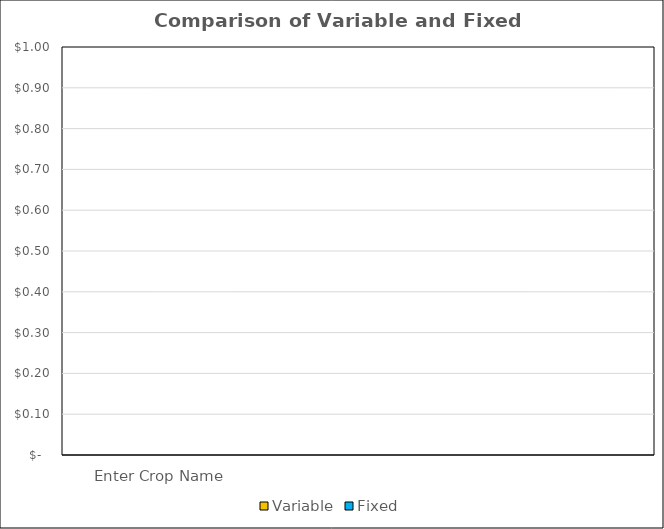
| Category | Variable | Fixed |
|---|---|---|
| Enter Crop Name | 0 | 0 |